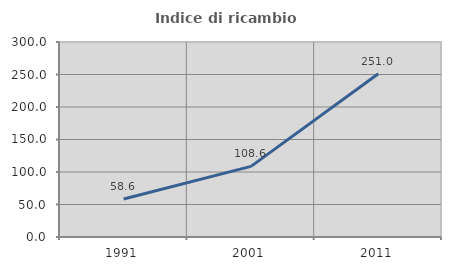
| Category | Indice di ricambio occupazionale  |
|---|---|
| 1991.0 | 58.562 |
| 2001.0 | 108.627 |
| 2011.0 | 251.031 |